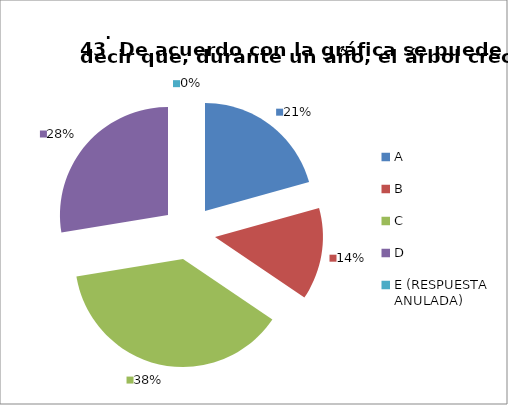
| Category | CANTIDAD DE RESPUESTAS PREGUNTA (43) | PORCENTAJE |
|---|---|---|
| A | 6 | 0.207 |
| B | 4 | 0.138 |
| C | 11 | 0.379 |
| D | 8 | 0.276 |
| E (RESPUESTA ANULADA) | 0 | 0 |